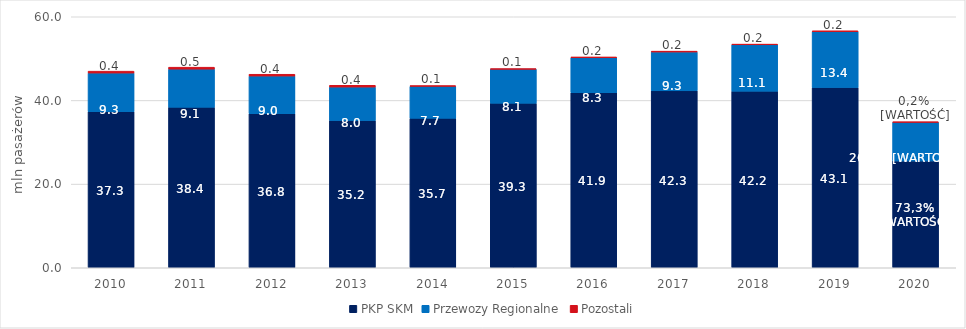
| Category | PKP SKM | Przewozy Regionalne | Pozostali |
|---|---|---|---|
| 2010 | 37.301 | 9.253 | 0.446 |
| 2011 | 38.37 | 9.11 | 0.47 |
| 2012 | 36.818 | 9.02 | 0.422 |
| 2013 | 35.198 | 8.007 | 0.416 |
| 2014 | 35.729 | 7.659 | 0.145 |
| 2015 | 39.34 | 8.142 | 0.059 |
| 2016 | 41.856 | 8.335 | 0.208 |
| 2017 | 42.302 | 9.284 | 0.199 |
| 2018 | 42.218 | 11.078 | 0.17 |
| 2019 | 43.094 | 13.356 | 0.181 |
| 2020 | 25.537 | 9.242 | 0.073 |